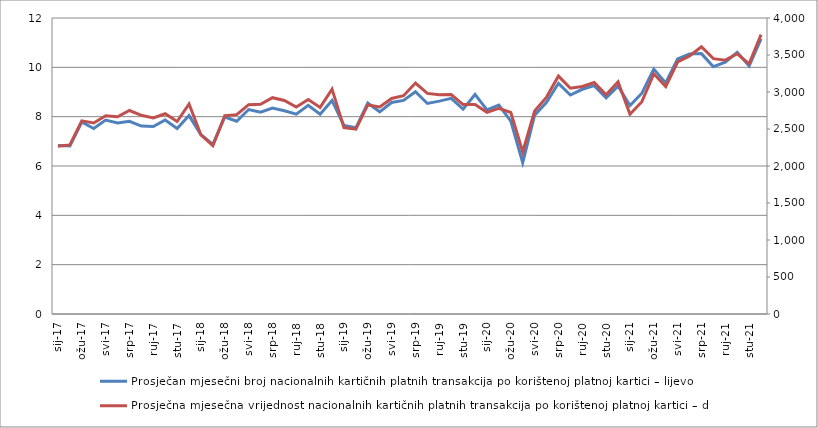
| Category | Prosječan mjesečni broj nacionalnih kartičnih platnih transakcija po korištenoj platnoj kartici – lijevo |
|---|---|
| 2017-01-01 | 6.83 |
| 2017-02-01 | 6.812 |
| 2017-03-01 | 7.784 |
| 2017-04-01 | 7.52 |
| 2017-05-01 | 7.863 |
| 2017-06-01 | 7.746 |
| 2017-07-01 | 7.813 |
| 2017-08-01 | 7.618 |
| 2017-09-01 | 7.6 |
| 2017-10-01 | 7.866 |
| 2017-11-01 | 7.52 |
| 2017-12-01 | 8.044 |
| 2018-01-01 | 7.27 |
| 2018-02-01 | 6.875 |
| 2018-03-01 | 7.986 |
| 2018-04-01 | 7.816 |
| 2018-05-01 | 8.289 |
| 2018-06-01 | 8.183 |
| 2018-07-01 | 8.35 |
| 2018-08-01 | 8.239 |
| 2018-09-01 | 8.104 |
| 2018-10-01 | 8.459 |
| 2018-11-01 | 8.096 |
| 2018-12-01 | 8.656 |
| 2019-01-01 | 7.648 |
| 2019-02-01 | 7.548 |
| 2019-03-01 | 8.554 |
| 2019-04-01 | 8.197 |
| 2019-05-01 | 8.576 |
| 2019-06-01 | 8.661 |
| 2019-07-01 | 9.012 |
| 2019-08-01 | 8.536 |
| 2019-09-01 | 8.63 |
| 2019-10-01 | 8.741 |
| 2019-11-01 | 8.304 |
| 2019-12-01 | 8.901 |
| 2020-01-01 | 8.276 |
| 2020-02-01 | 8.467 |
| 2020-03-01 | 7.817 |
| 2020-04-01 | 6.137 |
| 2020-05-01 | 8.059 |
| 2020-06-01 | 8.586 |
| 2020-07-01 | 9.352 |
| 2020-08-01 | 8.878 |
| 2020-09-01 | 9.111 |
| 2020-10-01 | 9.259 |
| 2020-11-01 | 8.761 |
| 2020-12-01 | 9.241 |
| 2021-01-01 | 8.451 |
| 2021-02-01 | 8.952 |
| 2021-03-01 | 9.929 |
| 2021-04-01 | 9.366 |
| 2021-05-01 | 10.337 |
| 2021-06-01 | 10.536 |
| 2021-07-01 | 10.556 |
| 2021-08-01 | 10.027 |
| 2021-09-01 | 10.21 |
| 2021-10-01 | 10.61 |
| 2021-11-01 | 10.058 |
| 2021-12-01 | 11.157 |